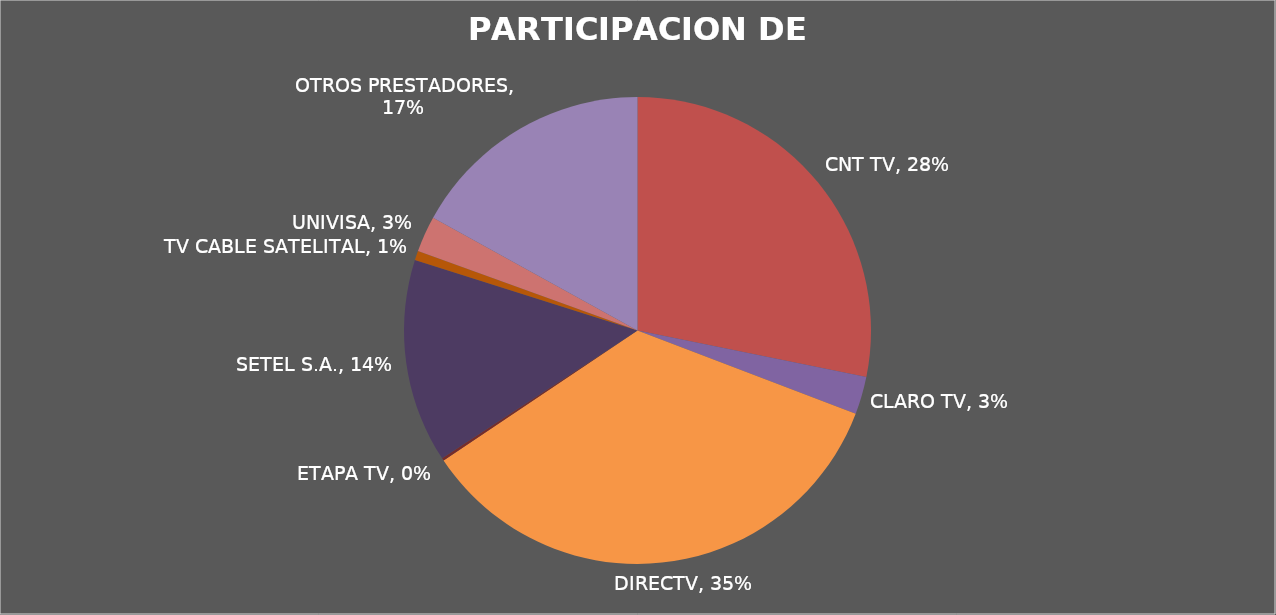
| Category | PARTICIPACION DE MERCADO |
|---|---|
| CNT TV | 0.282 |
| CLARO TV | 0.026 |
| DIRECTV | 0.349 |
| ETAPA TV | 0.002 |
| SETEL S.A. | 0.141 |
| TV CABLE SATELITAL | 0.006 |
| UNIVISA | 0.025 |
| OTROS PRESTADORES | 0.17 |